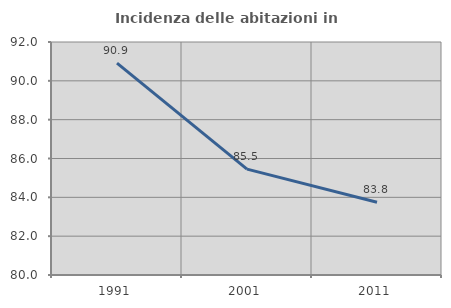
| Category | Incidenza delle abitazioni in proprietà  |
|---|---|
| 1991.0 | 90.909 |
| 2001.0 | 85.455 |
| 2011.0 | 83.75 |